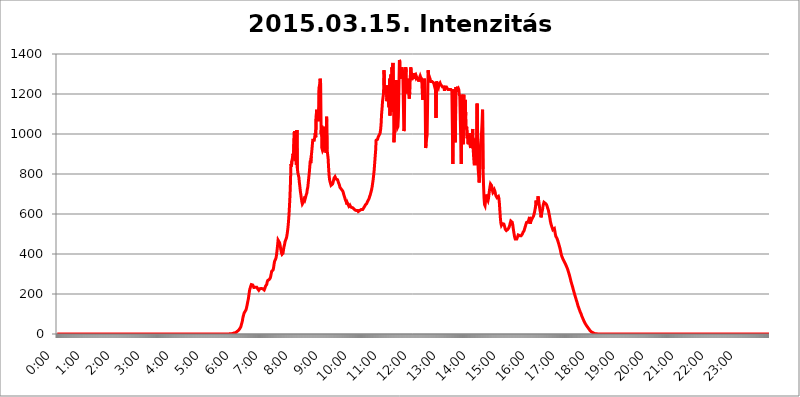
| Category | 2015.03.15. Intenzitás [W/m^2] |
|---|---|
| 0.0 | -0.256 |
| 0.0006944444444444445 | -0.256 |
| 0.001388888888888889 | -0.256 |
| 0.0020833333333333333 | -0.256 |
| 0.002777777777777778 | -0.256 |
| 0.003472222222222222 | -0.256 |
| 0.004166666666666667 | -0.256 |
| 0.004861111111111111 | -0.256 |
| 0.005555555555555556 | -0.256 |
| 0.0062499999999999995 | -0.256 |
| 0.006944444444444444 | -0.256 |
| 0.007638888888888889 | -0.256 |
| 0.008333333333333333 | -0.256 |
| 0.009027777777777779 | -0.256 |
| 0.009722222222222222 | -0.256 |
| 0.010416666666666666 | -0.256 |
| 0.011111111111111112 | -0.256 |
| 0.011805555555555555 | -0.256 |
| 0.012499999999999999 | -0.256 |
| 0.013194444444444444 | -0.256 |
| 0.013888888888888888 | -0.256 |
| 0.014583333333333332 | -0.256 |
| 0.015277777777777777 | -0.256 |
| 0.015972222222222224 | -0.256 |
| 0.016666666666666666 | -0.256 |
| 0.017361111111111112 | -0.256 |
| 0.018055555555555557 | -0.256 |
| 0.01875 | -0.256 |
| 0.019444444444444445 | -0.256 |
| 0.02013888888888889 | -0.256 |
| 0.020833333333333332 | -0.256 |
| 0.02152777777777778 | -0.256 |
| 0.022222222222222223 | -0.256 |
| 0.02291666666666667 | -0.256 |
| 0.02361111111111111 | -0.256 |
| 0.024305555555555556 | -0.256 |
| 0.024999999999999998 | -0.256 |
| 0.025694444444444447 | -0.256 |
| 0.02638888888888889 | -0.256 |
| 0.027083333333333334 | -0.256 |
| 0.027777777777777776 | -0.256 |
| 0.02847222222222222 | -0.256 |
| 0.029166666666666664 | -0.256 |
| 0.029861111111111113 | -0.256 |
| 0.030555555555555555 | -0.256 |
| 0.03125 | -0.256 |
| 0.03194444444444445 | -0.256 |
| 0.03263888888888889 | -0.256 |
| 0.03333333333333333 | -0.256 |
| 0.034027777777777775 | -0.256 |
| 0.034722222222222224 | -0.256 |
| 0.035416666666666666 | -0.256 |
| 0.036111111111111115 | -0.256 |
| 0.03680555555555556 | -0.256 |
| 0.0375 | -0.256 |
| 0.03819444444444444 | -0.256 |
| 0.03888888888888889 | -0.256 |
| 0.03958333333333333 | -0.256 |
| 0.04027777777777778 | -0.256 |
| 0.04097222222222222 | -0.256 |
| 0.041666666666666664 | -0.256 |
| 0.042361111111111106 | -0.256 |
| 0.04305555555555556 | -0.256 |
| 0.043750000000000004 | -0.256 |
| 0.044444444444444446 | -0.256 |
| 0.04513888888888889 | -0.256 |
| 0.04583333333333334 | -0.256 |
| 0.04652777777777778 | -0.256 |
| 0.04722222222222222 | -0.256 |
| 0.04791666666666666 | -0.256 |
| 0.04861111111111111 | -0.256 |
| 0.049305555555555554 | -0.256 |
| 0.049999999999999996 | -0.256 |
| 0.05069444444444445 | -0.256 |
| 0.051388888888888894 | -0.256 |
| 0.052083333333333336 | -0.256 |
| 0.05277777777777778 | -0.256 |
| 0.05347222222222222 | -0.256 |
| 0.05416666666666667 | -0.256 |
| 0.05486111111111111 | -0.256 |
| 0.05555555555555555 | -0.256 |
| 0.05625 | -0.256 |
| 0.05694444444444444 | -0.256 |
| 0.057638888888888885 | -0.256 |
| 0.05833333333333333 | -0.256 |
| 0.05902777777777778 | -0.256 |
| 0.059722222222222225 | -0.256 |
| 0.06041666666666667 | -0.256 |
| 0.061111111111111116 | -0.256 |
| 0.06180555555555556 | -0.256 |
| 0.0625 | -0.256 |
| 0.06319444444444444 | -0.256 |
| 0.06388888888888888 | -0.256 |
| 0.06458333333333334 | -0.256 |
| 0.06527777777777778 | -0.256 |
| 0.06597222222222222 | -0.256 |
| 0.06666666666666667 | -0.256 |
| 0.06736111111111111 | -0.256 |
| 0.06805555555555555 | -0.256 |
| 0.06874999999999999 | -0.256 |
| 0.06944444444444443 | -0.256 |
| 0.07013888888888889 | -0.256 |
| 0.07083333333333333 | -0.256 |
| 0.07152777777777779 | -0.256 |
| 0.07222222222222223 | -0.256 |
| 0.07291666666666667 | -0.256 |
| 0.07361111111111111 | -0.256 |
| 0.07430555555555556 | -0.256 |
| 0.075 | -0.256 |
| 0.07569444444444444 | -0.256 |
| 0.0763888888888889 | -0.256 |
| 0.07708333333333334 | -0.256 |
| 0.07777777777777778 | -0.256 |
| 0.07847222222222222 | -0.256 |
| 0.07916666666666666 | -0.256 |
| 0.0798611111111111 | -0.256 |
| 0.08055555555555556 | -0.256 |
| 0.08125 | -0.256 |
| 0.08194444444444444 | -0.256 |
| 0.08263888888888889 | -0.256 |
| 0.08333333333333333 | -0.256 |
| 0.08402777777777777 | -0.256 |
| 0.08472222222222221 | -0.256 |
| 0.08541666666666665 | -0.256 |
| 0.08611111111111112 | -0.256 |
| 0.08680555555555557 | -0.256 |
| 0.08750000000000001 | -0.256 |
| 0.08819444444444445 | -0.256 |
| 0.08888888888888889 | -0.256 |
| 0.08958333333333333 | -0.256 |
| 0.09027777777777778 | -0.256 |
| 0.09097222222222222 | -0.256 |
| 0.09166666666666667 | -0.256 |
| 0.09236111111111112 | -0.256 |
| 0.09305555555555556 | -0.256 |
| 0.09375 | -0.256 |
| 0.09444444444444444 | -0.256 |
| 0.09513888888888888 | -0.256 |
| 0.09583333333333333 | -0.256 |
| 0.09652777777777777 | -0.256 |
| 0.09722222222222222 | -0.256 |
| 0.09791666666666667 | -0.256 |
| 0.09861111111111111 | -0.256 |
| 0.09930555555555555 | -0.256 |
| 0.09999999999999999 | -0.256 |
| 0.10069444444444443 | -0.256 |
| 0.1013888888888889 | -0.256 |
| 0.10208333333333335 | -0.256 |
| 0.10277777777777779 | -0.256 |
| 0.10347222222222223 | -0.256 |
| 0.10416666666666667 | -0.256 |
| 0.10486111111111111 | -0.256 |
| 0.10555555555555556 | -0.256 |
| 0.10625 | -0.256 |
| 0.10694444444444444 | -0.256 |
| 0.1076388888888889 | -0.256 |
| 0.10833333333333334 | -0.256 |
| 0.10902777777777778 | -0.256 |
| 0.10972222222222222 | -0.256 |
| 0.1111111111111111 | -0.256 |
| 0.11180555555555556 | -0.256 |
| 0.11180555555555556 | -0.256 |
| 0.1125 | -0.256 |
| 0.11319444444444444 | -0.256 |
| 0.11388888888888889 | -0.256 |
| 0.11458333333333333 | -0.256 |
| 0.11527777777777777 | -0.256 |
| 0.11597222222222221 | -0.256 |
| 0.11666666666666665 | -0.256 |
| 0.1173611111111111 | -0.256 |
| 0.11805555555555557 | -0.256 |
| 0.11944444444444445 | -0.256 |
| 0.12013888888888889 | -0.256 |
| 0.12083333333333333 | -0.256 |
| 0.12152777777777778 | -0.256 |
| 0.12222222222222223 | -0.256 |
| 0.12291666666666667 | -0.256 |
| 0.12291666666666667 | -0.256 |
| 0.12361111111111112 | -0.256 |
| 0.12430555555555556 | -0.256 |
| 0.125 | -0.256 |
| 0.12569444444444444 | -0.256 |
| 0.12638888888888888 | -0.256 |
| 0.12708333333333333 | -0.256 |
| 0.16875 | -0.256 |
| 0.12847222222222224 | -0.256 |
| 0.12916666666666668 | -0.256 |
| 0.12986111111111112 | -0.256 |
| 0.13055555555555556 | -0.256 |
| 0.13125 | -0.256 |
| 0.13194444444444445 | -0.256 |
| 0.1326388888888889 | -0.256 |
| 0.13333333333333333 | -0.256 |
| 0.13402777777777777 | -0.256 |
| 0.13402777777777777 | -0.256 |
| 0.13472222222222222 | -0.256 |
| 0.13541666666666666 | -0.256 |
| 0.1361111111111111 | -0.256 |
| 0.13749999999999998 | -0.256 |
| 0.13819444444444443 | -0.256 |
| 0.1388888888888889 | -0.256 |
| 0.13958333333333334 | -0.256 |
| 0.14027777777777778 | -0.256 |
| 0.14097222222222222 | -0.256 |
| 0.14166666666666666 | -0.256 |
| 0.1423611111111111 | -0.256 |
| 0.14305555555555557 | -0.256 |
| 0.14375000000000002 | -0.256 |
| 0.14444444444444446 | -0.256 |
| 0.1451388888888889 | -0.256 |
| 0.1451388888888889 | -0.256 |
| 0.14652777777777778 | -0.256 |
| 0.14722222222222223 | -0.256 |
| 0.14791666666666667 | -0.256 |
| 0.1486111111111111 | -0.256 |
| 0.14930555555555555 | -0.256 |
| 0.15 | -0.256 |
| 0.15069444444444444 | -0.256 |
| 0.15138888888888888 | -0.256 |
| 0.15208333333333332 | -0.256 |
| 0.15277777777777776 | -0.256 |
| 0.15347222222222223 | -0.256 |
| 0.15416666666666667 | -0.256 |
| 0.15486111111111112 | -0.256 |
| 0.15555555555555556 | -0.256 |
| 0.15625 | -0.256 |
| 0.15694444444444444 | -0.256 |
| 0.15763888888888888 | -0.256 |
| 0.15833333333333333 | -0.256 |
| 0.15902777777777777 | -0.256 |
| 0.15972222222222224 | -0.256 |
| 0.16041666666666668 | -0.256 |
| 0.16111111111111112 | -0.256 |
| 0.16180555555555556 | -0.256 |
| 0.1625 | -0.256 |
| 0.16319444444444445 | -0.256 |
| 0.1638888888888889 | -0.256 |
| 0.16458333333333333 | -0.256 |
| 0.16527777777777777 | -0.256 |
| 0.16597222222222222 | -0.256 |
| 0.16666666666666666 | -0.256 |
| 0.1673611111111111 | -0.256 |
| 0.16805555555555554 | -0.256 |
| 0.16874999999999998 | -0.256 |
| 0.16944444444444443 | -0.256 |
| 0.17013888888888887 | -0.256 |
| 0.1708333333333333 | -0.256 |
| 0.17152777777777775 | -0.256 |
| 0.17222222222222225 | -0.256 |
| 0.1729166666666667 | -0.256 |
| 0.17361111111111113 | -0.256 |
| 0.17430555555555557 | -0.256 |
| 0.17500000000000002 | -0.256 |
| 0.17569444444444446 | -0.256 |
| 0.1763888888888889 | -0.256 |
| 0.17708333333333334 | -0.256 |
| 0.17777777777777778 | -0.256 |
| 0.17847222222222223 | -0.256 |
| 0.17916666666666667 | -0.256 |
| 0.1798611111111111 | -0.256 |
| 0.18055555555555555 | -0.256 |
| 0.18125 | -0.256 |
| 0.18194444444444444 | -0.256 |
| 0.1826388888888889 | -0.256 |
| 0.18333333333333335 | -0.256 |
| 0.1840277777777778 | -0.256 |
| 0.18472222222222223 | -0.256 |
| 0.18541666666666667 | -0.256 |
| 0.18611111111111112 | -0.256 |
| 0.18680555555555556 | -0.256 |
| 0.1875 | -0.256 |
| 0.18819444444444444 | -0.256 |
| 0.18888888888888888 | -0.256 |
| 0.18958333333333333 | -0.256 |
| 0.19027777777777777 | -0.256 |
| 0.1909722222222222 | -0.256 |
| 0.19166666666666665 | -0.256 |
| 0.19236111111111112 | -0.256 |
| 0.19305555555555554 | -0.256 |
| 0.19375 | -0.256 |
| 0.19444444444444445 | -0.256 |
| 0.1951388888888889 | -0.256 |
| 0.19583333333333333 | -0.256 |
| 0.19652777777777777 | -0.256 |
| 0.19722222222222222 | -0.256 |
| 0.19791666666666666 | -0.256 |
| 0.1986111111111111 | -0.256 |
| 0.19930555555555554 | -0.256 |
| 0.19999999999999998 | -0.256 |
| 0.20069444444444443 | -0.256 |
| 0.20138888888888887 | -0.256 |
| 0.2020833333333333 | -0.256 |
| 0.2027777777777778 | -0.256 |
| 0.2034722222222222 | -0.256 |
| 0.2041666666666667 | -0.256 |
| 0.20486111111111113 | -0.256 |
| 0.20555555555555557 | -0.256 |
| 0.20625000000000002 | -0.256 |
| 0.20694444444444446 | -0.256 |
| 0.2076388888888889 | -0.256 |
| 0.20833333333333334 | -0.256 |
| 0.20902777777777778 | -0.256 |
| 0.20972222222222223 | -0.256 |
| 0.21041666666666667 | -0.256 |
| 0.2111111111111111 | -0.256 |
| 0.21180555555555555 | -0.256 |
| 0.2125 | -0.256 |
| 0.21319444444444444 | -0.256 |
| 0.2138888888888889 | -0.256 |
| 0.21458333333333335 | -0.256 |
| 0.2152777777777778 | -0.256 |
| 0.21597222222222223 | -0.256 |
| 0.21666666666666667 | -0.256 |
| 0.21736111111111112 | -0.256 |
| 0.21805555555555556 | -0.256 |
| 0.21875 | -0.256 |
| 0.21944444444444444 | -0.256 |
| 0.22013888888888888 | -0.256 |
| 0.22083333333333333 | -0.256 |
| 0.22152777777777777 | -0.256 |
| 0.2222222222222222 | -0.256 |
| 0.22291666666666665 | -0.256 |
| 0.2236111111111111 | -0.256 |
| 0.22430555555555556 | -0.256 |
| 0.225 | -0.256 |
| 0.22569444444444445 | -0.256 |
| 0.2263888888888889 | -0.256 |
| 0.22708333333333333 | -0.256 |
| 0.22777777777777777 | -0.256 |
| 0.22847222222222222 | -0.256 |
| 0.22916666666666666 | -0.256 |
| 0.2298611111111111 | -0.256 |
| 0.23055555555555554 | -0.256 |
| 0.23124999999999998 | -0.256 |
| 0.23194444444444443 | -0.256 |
| 0.23263888888888887 | -0.256 |
| 0.2333333333333333 | -0.256 |
| 0.2340277777777778 | -0.256 |
| 0.2347222222222222 | -0.256 |
| 0.2354166666666667 | -0.256 |
| 0.23611111111111113 | -0.256 |
| 0.23680555555555557 | -0.256 |
| 0.23750000000000002 | -0.256 |
| 0.23819444444444446 | -0.256 |
| 0.2388888888888889 | -0.256 |
| 0.23958333333333334 | -0.256 |
| 0.24027777777777778 | -0.256 |
| 0.24097222222222223 | 1.09 |
| 0.24166666666666667 | 1.09 |
| 0.2423611111111111 | 1.09 |
| 0.24305555555555555 | 1.09 |
| 0.24375 | 1.09 |
| 0.24444444444444446 | 2.439 |
| 0.24513888888888888 | 2.439 |
| 0.24583333333333335 | 2.439 |
| 0.2465277777777778 | 3.791 |
| 0.24722222222222223 | 3.791 |
| 0.24791666666666667 | 5.146 |
| 0.24861111111111112 | 6.503 |
| 0.24930555555555556 | 6.503 |
| 0.25 | 6.503 |
| 0.25069444444444444 | 9.225 |
| 0.2513888888888889 | 10.589 |
| 0.2520833333333333 | 11.956 |
| 0.25277777777777777 | 14.696 |
| 0.2534722222222222 | 16.069 |
| 0.25416666666666665 | 18.822 |
| 0.2548611111111111 | 21.582 |
| 0.2555555555555556 | 24.35 |
| 0.25625000000000003 | 28.514 |
| 0.2569444444444445 | 32.691 |
| 0.2576388888888889 | 38.28 |
| 0.25833333333333336 | 48.1 |
| 0.2590277777777778 | 56.548 |
| 0.25972222222222224 | 66.423 |
| 0.2604166666666667 | 81.946 |
| 0.2611111111111111 | 91.806 |
| 0.26180555555555557 | 101.634 |
| 0.2625 | 107.232 |
| 0.26319444444444445 | 105.834 |
| 0.2638888888888889 | 110.025 |
| 0.26458333333333334 | 119.766 |
| 0.2652777777777778 | 128.065 |
| 0.2659722222222222 | 139.051 |
| 0.26666666666666666 | 151.286 |
| 0.2673611111111111 | 164.712 |
| 0.26805555555555555 | 176.631 |
| 0.26875 | 193.561 |
| 0.26944444444444443 | 211.405 |
| 0.2701388888888889 | 225.146 |
| 0.2708333333333333 | 232.54 |
| 0.27152777777777776 | 241.083 |
| 0.2722222222222222 | 247.131 |
| 0.27291666666666664 | 248.335 |
| 0.2736111111111111 | 247.131 |
| 0.2743055555555555 | 244.717 |
| 0.27499999999999997 | 238.651 |
| 0.27569444444444446 | 232.54 |
| 0.27638888888888885 | 230.083 |
| 0.27708333333333335 | 230.083 |
| 0.2777777777777778 | 233.766 |
| 0.27847222222222223 | 238.651 |
| 0.2791666666666667 | 237.433 |
| 0.2798611111111111 | 233.766 |
| 0.28055555555555556 | 230.083 |
| 0.28125 | 225.146 |
| 0.28194444444444444 | 221.422 |
| 0.2826388888888889 | 218.93 |
| 0.2833333333333333 | 221.422 |
| 0.28402777777777777 | 226.383 |
| 0.2847222222222222 | 225.146 |
| 0.28541666666666665 | 225.146 |
| 0.28611111111111115 | 227.618 |
| 0.28680555555555554 | 227.618 |
| 0.28750000000000003 | 230.083 |
| 0.2881944444444445 | 226.383 |
| 0.2888888888888889 | 223.906 |
| 0.28958333333333336 | 221.422 |
| 0.2902777777777778 | 220.177 |
| 0.29097222222222224 | 226.383 |
| 0.2916666666666667 | 233.766 |
| 0.2923611111111111 | 241.083 |
| 0.29305555555555557 | 243.507 |
| 0.29375 | 247.131 |
| 0.29444444444444445 | 259.104 |
| 0.2951388888888889 | 267.396 |
| 0.29583333333333334 | 268.576 |
| 0.2965277777777778 | 268.576 |
| 0.2972222222222222 | 272.106 |
| 0.29791666666666666 | 276.797 |
| 0.2986111111111111 | 279.136 |
| 0.29930555555555555 | 287.293 |
| 0.3 | 300.041 |
| 0.30069444444444443 | 312.749 |
| 0.3013888888888889 | 316.215 |
| 0.3020833333333333 | 316.215 |
| 0.30277777777777776 | 320.84 |
| 0.3034722222222222 | 332.443 |
| 0.30416666666666664 | 350.049 |
| 0.3048611111111111 | 364.422 |
| 0.3055555555555555 | 369.291 |
| 0.30624999999999997 | 374.206 |
| 0.3069444444444444 | 381.674 |
| 0.3076388888888889 | 398.318 |
| 0.30833333333333335 | 419.883 |
| 0.3090277777777778 | 442.962 |
| 0.30972222222222223 | 469.557 |
| 0.3104166666666667 | 474.507 |
| 0.3111111111111111 | 464.688 |
| 0.31180555555555556 | 456.747 |
| 0.3125 | 445.971 |
| 0.31319444444444444 | 429.773 |
| 0.3138888888888889 | 415.735 |
| 0.3145833333333333 | 404.916 |
| 0.31527777777777777 | 398.318 |
| 0.3159722222222222 | 395.711 |
| 0.31666666666666665 | 403.587 |
| 0.31736111111111115 | 422.678 |
| 0.31805555555555554 | 437.031 |
| 0.31875000000000003 | 445.971 |
| 0.3194444444444445 | 461.486 |
| 0.3201388888888889 | 467.925 |
| 0.32083333333333336 | 474.507 |
| 0.3215277777777778 | 481.238 |
| 0.32222222222222224 | 495.176 |
| 0.3229166666666667 | 511.671 |
| 0.3236111111111111 | 533.12 |
| 0.32430555555555557 | 560.495 |
| 0.325 | 595.145 |
| 0.32569444444444445 | 638.912 |
| 0.3263888888888889 | 688.102 |
| 0.32708333333333334 | 757.414 |
| 0.3277777777777778 | 849.92 |
| 0.3284722222222222 | 837.51 |
| 0.32916666666666666 | 866.865 |
| 0.3298611111111111 | 879.878 |
| 0.33055555555555555 | 902.16 |
| 0.33125 | 893.157 |
| 0.33194444444444443 | 897.643 |
| 0.3326388888888889 | 1014.809 |
| 0.3333333333333333 | 866.865 |
| 0.3340277777777778 | 888.701 |
| 0.3347222222222222 | 871.173 |
| 0.3354166666666667 | 845.755 |
| 0.3361111111111111 | 1020.106 |
| 0.3368055555555556 | 825.351 |
| 0.33749999999999997 | 805.632 |
| 0.33819444444444446 | 801.768 |
| 0.33888888888888885 | 782.842 |
| 0.33958333333333335 | 757.414 |
| 0.34027777777777773 | 736.574 |
| 0.34097222222222223 | 713.328 |
| 0.3416666666666666 | 697.399 |
| 0.3423611111111111 | 678.997 |
| 0.3430555555555555 | 661.343 |
| 0.34375 | 649.973 |
| 0.3444444444444445 | 649.973 |
| 0.3451388888888889 | 658.471 |
| 0.3458333333333334 | 664.234 |
| 0.34652777777777777 | 670.078 |
| 0.34722222222222227 | 688.102 |
| 0.34791666666666665 | 678.997 |
| 0.34861111111111115 | 682.011 |
| 0.34930555555555554 | 697.399 |
| 0.35000000000000003 | 703.704 |
| 0.3506944444444444 | 723.153 |
| 0.3513888888888889 | 733.184 |
| 0.3520833333333333 | 757.414 |
| 0.3527777777777778 | 782.842 |
| 0.3534722222222222 | 805.632 |
| 0.3541666666666667 | 801.768 |
| 0.3548611111111111 | 866.865 |
| 0.35555555555555557 | 854.113 |
| 0.35625 | 888.701 |
| 0.35694444444444445 | 911.285 |
| 0.3576388888888889 | 939.404 |
| 0.35833333333333334 | 968.671 |
| 0.3590277777777778 | 973.663 |
| 0.3597222222222222 | 963.712 |
| 0.36041666666666666 | 968.671 |
| 0.3611111111111111 | 983.747 |
| 0.36180555555555555 | 1004.318 |
| 0.3625 | 983.747 |
| 0.36319444444444443 | 1092.203 |
| 0.3638888888888889 | 1121.587 |
| 0.3645833333333333 | 1080.711 |
| 0.3652777777777778 | 1115.634 |
| 0.3659722222222222 | 1080.711 |
| 0.3666666666666667 | 1063.751 |
| 0.3673611111111111 | 1235.465 |
| 0.3680555555555556 | 1248.934 |
| 0.36874999999999997 | 1276.38 |
| 0.36944444444444446 | 1248.934 |
| 0.37013888888888885 | 999.125 |
| 0.37083333333333335 | 1041.644 |
| 0.37152777777777773 | 925.203 |
| 0.37222222222222223 | 915.893 |
| 0.3729166666666666 | 915.893 |
| 0.3736111111111111 | 925.203 |
| 0.3743055555555555 | 944.201 |
| 0.375 | 1036.206 |
| 0.3756944444444445 | 944.201 |
| 0.3763888888888889 | 915.893 |
| 0.3770833333333334 | 906.707 |
| 0.37777777777777777 | 1086.439 |
| 0.37847222222222227 | 920.533 |
| 0.37916666666666665 | 915.893 |
| 0.37986111111111115 | 879.878 |
| 0.38055555555555554 | 833.43 |
| 0.38125000000000003 | 794.119 |
| 0.3819444444444444 | 771.794 |
| 0.3826388888888889 | 760.972 |
| 0.3833333333333333 | 757.414 |
| 0.3840277777777778 | 743.425 |
| 0.3847222222222222 | 743.425 |
| 0.3854166666666667 | 746.886 |
| 0.3861111111111111 | 750.371 |
| 0.38680555555555557 | 757.414 |
| 0.3875 | 768.162 |
| 0.38819444444444445 | 779.134 |
| 0.3888888888888889 | 782.842 |
| 0.38958333333333334 | 786.575 |
| 0.3902777777777778 | 782.842 |
| 0.3909722222222222 | 775.451 |
| 0.39166666666666666 | 775.451 |
| 0.3923611111111111 | 775.451 |
| 0.39305555555555555 | 771.794 |
| 0.39375 | 764.555 |
| 0.39444444444444443 | 757.414 |
| 0.3951388888888889 | 750.371 |
| 0.3958333333333333 | 743.425 |
| 0.3965277777777778 | 733.184 |
| 0.3972222222222222 | 729.817 |
| 0.3979166666666667 | 726.474 |
| 0.3986111111111111 | 726.474 |
| 0.3993055555555556 | 719.855 |
| 0.39999999999999997 | 716.58 |
| 0.40069444444444446 | 713.328 |
| 0.40138888888888885 | 703.704 |
| 0.40208333333333335 | 694.278 |
| 0.40277777777777773 | 691.18 |
| 0.40347222222222223 | 678.997 |
| 0.4041666666666666 | 670.078 |
| 0.4048611111111111 | 664.234 |
| 0.4055555555555555 | 658.471 |
| 0.40625 | 647.179 |
| 0.4069444444444445 | 655.618 |
| 0.4076388888888889 | 655.618 |
| 0.4083333333333334 | 644.405 |
| 0.40902777777777777 | 638.912 |
| 0.40972222222222227 | 641.649 |
| 0.41041666666666665 | 644.405 |
| 0.41111111111111115 | 638.912 |
| 0.41180555555555554 | 636.194 |
| 0.41250000000000003 | 633.495 |
| 0.4131944444444444 | 633.495 |
| 0.4138888888888889 | 633.495 |
| 0.4145833333333333 | 630.814 |
| 0.4152777777777778 | 628.152 |
| 0.4159722222222222 | 625.508 |
| 0.4166666666666667 | 622.881 |
| 0.4173611111111111 | 620.273 |
| 0.41805555555555557 | 622.881 |
| 0.41875 | 620.273 |
| 0.41944444444444445 | 617.682 |
| 0.4201388888888889 | 615.11 |
| 0.42083333333333334 | 617.682 |
| 0.4215277777777778 | 617.682 |
| 0.4222222222222222 | 612.554 |
| 0.42291666666666666 | 610.016 |
| 0.4236111111111111 | 615.11 |
| 0.42430555555555555 | 617.682 |
| 0.425 | 617.682 |
| 0.42569444444444443 | 615.11 |
| 0.4263888888888889 | 622.881 |
| 0.4270833333333333 | 625.508 |
| 0.4277777777777778 | 620.273 |
| 0.4284722222222222 | 622.881 |
| 0.4291666666666667 | 625.508 |
| 0.4298611111111111 | 630.814 |
| 0.4305555555555556 | 633.495 |
| 0.43124999999999997 | 638.912 |
| 0.43194444444444446 | 644.405 |
| 0.43263888888888885 | 647.179 |
| 0.43333333333333335 | 647.179 |
| 0.43402777777777773 | 652.786 |
| 0.43472222222222223 | 658.471 |
| 0.4354166666666666 | 664.234 |
| 0.4361111111111111 | 667.146 |
| 0.4368055555555555 | 673.03 |
| 0.4375 | 678.997 |
| 0.4381944444444445 | 688.102 |
| 0.4388888888888889 | 694.278 |
| 0.4395833333333334 | 703.704 |
| 0.44027777777777777 | 713.328 |
| 0.44097222222222227 | 723.153 |
| 0.44166666666666665 | 736.574 |
| 0.44236111111111115 | 753.881 |
| 0.44305555555555554 | 771.794 |
| 0.44375000000000003 | 794.119 |
| 0.4444444444444444 | 817.382 |
| 0.4451388888888889 | 849.92 |
| 0.4458333333333333 | 884.274 |
| 0.4465277777777778 | 915.893 |
| 0.4472222222222222 | 968.671 |
| 0.4479166666666667 | 968.671 |
| 0.4486111111111111 | 973.663 |
| 0.44930555555555557 | 973.663 |
| 0.45 | 983.747 |
| 0.45069444444444445 | 988.839 |
| 0.4513888888888889 | 993.965 |
| 0.45208333333333334 | 999.125 |
| 0.4527777777777778 | 1004.318 |
| 0.4534722222222222 | 1020.106 |
| 0.45416666666666666 | 1047.117 |
| 0.4548611111111111 | 1098.004 |
| 0.45555555555555555 | 1127.578 |
| 0.45625 | 1164.337 |
| 0.45694444444444443 | 1164.337 |
| 0.4576388888888889 | 1202.523 |
| 0.4583333333333333 | 1318.845 |
| 0.4590277777777778 | 1209.029 |
| 0.4597222222222222 | 1222.164 |
| 0.4604166666666667 | 1228.794 |
| 0.4611111111111111 | 1202.523 |
| 0.4618055555555556 | 1242.179 |
| 0.46249999999999997 | 1164.337 |
| 0.46319444444444446 | 1228.794 |
| 0.46388888888888885 | 1235.465 |
| 0.46458333333333335 | 1151.928 |
| 0.46527777777777773 | 1133.607 |
| 0.46597222222222223 | 1276.38 |
| 0.4666666666666666 | 1092.203 |
| 0.4673611111111111 | 1092.203 |
| 0.4680555555555555 | 1297.416 |
| 0.46875 | 1109.72 |
| 0.4694444444444445 | 1333.352 |
| 0.4701388888888889 | 1304.515 |
| 0.4708333333333334 | 1355.45 |
| 0.47152777777777777 | 1255.731 |
| 0.47222222222222227 | 958.785 |
| 0.47291666666666665 | 1014.809 |
| 0.47361111111111115 | 1248.934 |
| 0.47430555555555554 | 1109.72 |
| 0.47500000000000003 | 1269.454 |
| 0.4756944444444444 | 1242.179 |
| 0.4763888888888889 | 1052.625 |
| 0.4770833333333333 | 1030.804 |
| 0.4777777777777778 | 1036.206 |
| 0.4784722222222222 | 1086.439 |
| 0.4791666666666667 | 1086.439 |
| 0.4798611111111111 | 1370.408 |
| 0.48055555555555557 | 1362.906 |
| 0.48125 | 1276.38 |
| 0.48194444444444445 | 1276.38 |
| 0.4826388888888889 | 1318.845 |
| 0.48333333333333334 | 1333.352 |
| 0.4840277777777778 | 1333.352 |
| 0.4847222222222222 | 1304.515 |
| 0.48541666666666666 | 1304.515 |
| 0.4861111111111111 | 1014.809 |
| 0.48680555555555555 | 1025.437 |
| 0.4875 | 1283.348 |
| 0.48819444444444443 | 1276.38 |
| 0.4888888888888889 | 1333.352 |
| 0.4895833333333333 | 1242.179 |
| 0.4902777777777778 | 1202.523 |
| 0.4909722222222222 | 1242.179 |
| 0.4916666666666667 | 1276.38 |
| 0.4923611111111111 | 1255.731 |
| 0.4930555555555556 | 1196.058 |
| 0.49374999999999997 | 1176.905 |
| 0.49444444444444446 | 1209.029 |
| 0.49513888888888885 | 1283.348 |
| 0.49583333333333335 | 1333.352 |
| 0.49652777777777773 | 1333.352 |
| 0.49722222222222223 | 1269.454 |
| 0.4979166666666666 | 1297.416 |
| 0.4986111111111111 | 1276.38 |
| 0.4993055555555555 | 1304.515 |
| 0.5 | 1276.38 |
| 0.5006944444444444 | 1304.515 |
| 0.5013888888888889 | 1297.416 |
| 0.5020833333333333 | 1290.36 |
| 0.5027777777777778 | 1283.348 |
| 0.5034722222222222 | 1290.36 |
| 0.5041666666666667 | 1290.36 |
| 0.5048611111111111 | 1290.36 |
| 0.5055555555555555 | 1269.454 |
| 0.50625 | 1283.348 |
| 0.5069444444444444 | 1262.571 |
| 0.5076388888888889 | 1276.38 |
| 0.5083333333333333 | 1283.348 |
| 0.5090277777777777 | 1290.36 |
| 0.5097222222222222 | 1283.348 |
| 0.5104166666666666 | 1283.348 |
| 0.5111111111111112 | 1276.38 |
| 0.5118055555555555 | 1276.38 |
| 0.5125000000000001 | 1170.601 |
| 0.5131944444444444 | 1269.454 |
| 0.513888888888889 | 1262.571 |
| 0.5145833333333333 | 1276.38 |
| 0.5152777777777778 | 1269.454 |
| 0.5159722222222222 | 1189.633 |
| 0.5166666666666667 | 929.905 |
| 0.517361111111111 | 949.03 |
| 0.5180555555555556 | 978.688 |
| 0.5187499999999999 | 993.965 |
| 0.5194444444444445 | 1151.928 |
| 0.5201388888888888 | 1318.845 |
| 0.5208333333333334 | 1297.416 |
| 0.5215277777777778 | 1290.36 |
| 0.5222222222222223 | 1283.348 |
| 0.5229166666666667 | 1276.38 |
| 0.5236111111111111 | 1262.571 |
| 0.5243055555555556 | 1262.571 |
| 0.525 | 1262.571 |
| 0.5256944444444445 | 1262.571 |
| 0.5263888888888889 | 1262.571 |
| 0.5270833333333333 | 1262.571 |
| 0.5277777777777778 | 1255.731 |
| 0.5284722222222222 | 1248.934 |
| 0.5291666666666667 | 1248.934 |
| 0.5298611111111111 | 1228.794 |
| 0.5305555555555556 | 1235.465 |
| 0.53125 | 1080.711 |
| 0.5319444444444444 | 1262.571 |
| 0.5326388888888889 | 1255.731 |
| 0.5333333333333333 | 1248.934 |
| 0.5340277777777778 | 1242.179 |
| 0.5347222222222222 | 1235.465 |
| 0.5354166666666667 | 1248.934 |
| 0.5361111111111111 | 1248.934 |
| 0.5368055555555555 | 1255.731 |
| 0.5375 | 1248.934 |
| 0.5381944444444444 | 1248.934 |
| 0.5388888888888889 | 1242.179 |
| 0.5395833333333333 | 1242.179 |
| 0.5402777777777777 | 1235.465 |
| 0.5409722222222222 | 1235.465 |
| 0.5416666666666666 | 1235.465 |
| 0.5423611111111112 | 1235.465 |
| 0.5430555555555555 | 1215.576 |
| 0.5437500000000001 | 1235.465 |
| 0.5444444444444444 | 1235.465 |
| 0.545138888888889 | 1235.465 |
| 0.5458333333333333 | 1235.465 |
| 0.5465277777777778 | 1235.465 |
| 0.5472222222222222 | 1235.465 |
| 0.5479166666666667 | 1222.164 |
| 0.548611111111111 | 1222.164 |
| 0.5493055555555556 | 1222.164 |
| 0.5499999999999999 | 1222.164 |
| 0.5506944444444445 | 1222.164 |
| 0.5513888888888888 | 1222.164 |
| 0.5520833333333334 | 1222.164 |
| 0.5527777777777778 | 1222.164 |
| 0.5534722222222223 | 1215.576 |
| 0.5541666666666667 | 1215.576 |
| 0.5548611111111111 | 849.92 |
| 0.5555555555555556 | 1222.164 |
| 0.55625 | 1222.164 |
| 0.5569444444444445 | 978.688 |
| 0.5576388888888889 | 1222.164 |
| 0.5583333333333333 | 958.785 |
| 0.5590277777777778 | 1235.465 |
| 0.5597222222222222 | 1235.465 |
| 0.5604166666666667 | 1235.465 |
| 0.5611111111111111 | 1222.164 |
| 0.5618055555555556 | 1222.164 |
| 0.5625 | 1228.794 |
| 0.5631944444444444 | 1222.164 |
| 0.5638888888888889 | 1196.058 |
| 0.5645833333333333 | 1189.633 |
| 0.5652777777777778 | 1189.633 |
| 0.5659722222222222 | 1189.633 |
| 0.5666666666666667 | 849.92 |
| 0.5673611111111111 | 1196.058 |
| 0.5680555555555555 | 1151.928 |
| 0.56875 | 1151.928 |
| 0.5694444444444444 | 949.03 |
| 0.5701388888888889 | 1196.058 |
| 0.5708333333333333 | 1069.368 |
| 0.5715277777777777 | 1052.625 |
| 0.5722222222222222 | 1170.601 |
| 0.5729166666666666 | 1092.203 |
| 0.5736111111111112 | 1025.437 |
| 0.5743055555555555 | 1036.206 |
| 0.5750000000000001 | 978.688 |
| 0.5756944444444444 | 1004.318 |
| 0.576388888888889 | 949.03 |
| 0.5770833333333333 | 978.688 |
| 0.5777777777777778 | 1004.318 |
| 0.5784722222222222 | 963.712 |
| 0.5791666666666667 | 939.404 |
| 0.579861111111111 | 929.905 |
| 0.5805555555555556 | 925.203 |
| 0.5812499999999999 | 929.905 |
| 0.5819444444444445 | 958.785 |
| 0.5826388888888888 | 1025.437 |
| 0.5833333333333334 | 925.203 |
| 0.5840277777777778 | 884.274 |
| 0.5847222222222223 | 849.92 |
| 0.5854166666666667 | 849.92 |
| 0.5861111111111111 | 849.92 |
| 0.5868055555555556 | 849.92 |
| 0.5875 | 978.688 |
| 0.5881944444444445 | 944.201 |
| 0.5888888888888889 | 1151.928 |
| 0.5895833333333333 | 988.839 |
| 0.5902777777777778 | 829.377 |
| 0.5909722222222222 | 794.119 |
| 0.5916666666666667 | 757.414 |
| 0.5923611111111111 | 782.842 |
| 0.5930555555555556 | 906.707 |
| 0.59375 | 949.03 |
| 0.5944444444444444 | 973.663 |
| 0.5951388888888889 | 1009.546 |
| 0.5958333333333333 | 1058.17 |
| 0.5965277777777778 | 1121.587 |
| 0.5972222222222222 | 825.351 |
| 0.5979166666666667 | 739.988 |
| 0.5986111111111111 | 678.997 |
| 0.5993055555555555 | 647.179 |
| 0.6 | 641.649 |
| 0.6006944444444444 | 664.234 |
| 0.6013888888888889 | 688.102 |
| 0.6020833333333333 | 697.399 |
| 0.6027777777777777 | 685.046 |
| 0.6034722222222222 | 673.03 |
| 0.6041666666666666 | 667.146 |
| 0.6048611111111112 | 678.997 |
| 0.6055555555555555 | 700.54 |
| 0.6062500000000001 | 719.855 |
| 0.6069444444444444 | 736.574 |
| 0.607638888888889 | 750.371 |
| 0.6083333333333333 | 753.881 |
| 0.6090277777777778 | 743.425 |
| 0.6097222222222222 | 733.184 |
| 0.6104166666666667 | 716.58 |
| 0.611111111111111 | 706.89 |
| 0.6118055555555556 | 706.89 |
| 0.6124999999999999 | 713.328 |
| 0.6131944444444445 | 719.855 |
| 0.6138888888888888 | 713.328 |
| 0.6145833333333334 | 700.54 |
| 0.6152777777777778 | 691.18 |
| 0.6159722222222223 | 688.102 |
| 0.6166666666666667 | 682.011 |
| 0.6173611111111111 | 682.011 |
| 0.6180555555555556 | 685.046 |
| 0.61875 | 688.102 |
| 0.6194444444444445 | 678.997 |
| 0.6201388888888889 | 652.786 |
| 0.6208333333333333 | 615.11 |
| 0.6215277777777778 | 578.542 |
| 0.6222222222222222 | 553.97 |
| 0.6229166666666667 | 543.376 |
| 0.6236111111111111 | 545.467 |
| 0.6243055555555556 | 551.823 |
| 0.625 | 553.97 |
| 0.6256944444444444 | 553.97 |
| 0.6263888888888889 | 549.691 |
| 0.6270833333333333 | 541.298 |
| 0.6277777777777778 | 533.12 |
| 0.6284722222222222 | 523.186 |
| 0.6291666666666667 | 519.3 |
| 0.6298611111111111 | 517.375 |
| 0.6305555555555555 | 517.375 |
| 0.63125 | 519.3 |
| 0.6319444444444444 | 523.186 |
| 0.6326388888888889 | 527.122 |
| 0.6333333333333333 | 531.108 |
| 0.6340277777777777 | 537.182 |
| 0.6347222222222222 | 545.467 |
| 0.6354166666666666 | 556.131 |
| 0.6361111111111112 | 564.917 |
| 0.6368055555555555 | 567.15 |
| 0.6375000000000001 | 564.917 |
| 0.6381944444444444 | 558.305 |
| 0.638888888888889 | 545.467 |
| 0.6395833333333333 | 527.122 |
| 0.6402777777777778 | 509.793 |
| 0.6409722222222222 | 495.176 |
| 0.6416666666666667 | 482.945 |
| 0.642361111111111 | 474.507 |
| 0.6430555555555556 | 471.198 |
| 0.6437499999999999 | 471.198 |
| 0.6444444444444445 | 474.507 |
| 0.6451388888888888 | 481.238 |
| 0.6458333333333334 | 488.126 |
| 0.6465277777777778 | 495.176 |
| 0.6472222222222223 | 496.965 |
| 0.6479166666666667 | 495.176 |
| 0.6486111111111111 | 491.63 |
| 0.6493055555555556 | 489.873 |
| 0.65 | 489.873 |
| 0.6506944444444445 | 491.63 |
| 0.6513888888888889 | 493.398 |
| 0.6520833333333333 | 498.764 |
| 0.6527777777777778 | 504.229 |
| 0.6534722222222222 | 509.793 |
| 0.6541666666666667 | 511.671 |
| 0.6548611111111111 | 517.375 |
| 0.6555555555555556 | 527.122 |
| 0.65625 | 535.145 |
| 0.6569444444444444 | 543.376 |
| 0.6576388888888889 | 551.823 |
| 0.6583333333333333 | 558.305 |
| 0.6590277777777778 | 560.495 |
| 0.6597222222222222 | 560.495 |
| 0.6604166666666667 | 560.495 |
| 0.6611111111111111 | 560.495 |
| 0.6618055555555555 | 560.495 |
| 0.6625 | 585.562 |
| 0.6631944444444444 | 551.823 |
| 0.6638888888888889 | 558.305 |
| 0.6645833333333333 | 564.917 |
| 0.6652777777777777 | 571.661 |
| 0.6659722222222222 | 576.233 |
| 0.6666666666666666 | 580.866 |
| 0.6673611111111111 | 585.562 |
| 0.6680555555555556 | 590.321 |
| 0.6687500000000001 | 600.035 |
| 0.6694444444444444 | 610.016 |
| 0.6701388888888888 | 622.881 |
| 0.6708333333333334 | 638.912 |
| 0.6715277777777778 | 667.146 |
| 0.6722222222222222 | 649.973 |
| 0.6729166666666666 | 652.786 |
| 0.6736111111111112 | 661.343 |
| 0.6743055555555556 | 688.102 |
| 0.6749999999999999 | 673.03 |
| 0.6756944444444444 | 655.618 |
| 0.6763888888888889 | 636.194 |
| 0.6770833333333334 | 617.682 |
| 0.6777777777777777 | 607.495 |
| 0.6784722222222223 | 583.206 |
| 0.6791666666666667 | 595.145 |
| 0.6798611111111111 | 610.016 |
| 0.6805555555555555 | 620.273 |
| 0.68125 | 638.912 |
| 0.6819444444444445 | 649.973 |
| 0.6826388888888889 | 658.471 |
| 0.6833333333333332 | 661.343 |
| 0.6840277777777778 | 655.618 |
| 0.6847222222222222 | 652.786 |
| 0.6854166666666667 | 652.786 |
| 0.686111111111111 | 647.179 |
| 0.6868055555555556 | 641.649 |
| 0.6875 | 633.495 |
| 0.6881944444444444 | 625.508 |
| 0.688888888888889 | 617.682 |
| 0.6895833333333333 | 604.992 |
| 0.6902777777777778 | 592.725 |
| 0.6909722222222222 | 578.542 |
| 0.6916666666666668 | 562.699 |
| 0.6923611111111111 | 551.823 |
| 0.6930555555555555 | 543.376 |
| 0.69375 | 535.145 |
| 0.6944444444444445 | 529.108 |
| 0.6951388888888889 | 521.237 |
| 0.6958333333333333 | 521.237 |
| 0.6965277777777777 | 525.148 |
| 0.6972222222222223 | 527.122 |
| 0.6979166666666666 | 513.561 |
| 0.6986111111111111 | 498.764 |
| 0.6993055555555556 | 488.126 |
| 0.7000000000000001 | 484.662 |
| 0.7006944444444444 | 479.541 |
| 0.7013888888888888 | 472.848 |
| 0.7020833333333334 | 466.302 |
| 0.7027777777777778 | 456.747 |
| 0.7034722222222222 | 449.011 |
| 0.7041666666666666 | 439.982 |
| 0.7048611111111112 | 431.211 |
| 0.7055555555555556 | 421.278 |
| 0.7062499999999999 | 408.934 |
| 0.7069444444444444 | 397.012 |
| 0.7076388888888889 | 389.27 |
| 0.7083333333333334 | 382.93 |
| 0.7090277777777777 | 376.682 |
| 0.7097222222222223 | 371.742 |
| 0.7104166666666667 | 366.851 |
| 0.7111111111111111 | 362.004 |
| 0.7118055555555555 | 357.196 |
| 0.7125 | 352.423 |
| 0.7131944444444445 | 346.501 |
| 0.7138888888888889 | 340.62 |
| 0.7145833333333332 | 334.774 |
| 0.7152777777777778 | 328.955 |
| 0.7159722222222222 | 321.998 |
| 0.7166666666666667 | 313.904 |
| 0.717361111111111 | 305.819 |
| 0.7180555555555556 | 297.728 |
| 0.71875 | 288.455 |
| 0.7194444444444444 | 279.136 |
| 0.720138888888889 | 268.576 |
| 0.7208333333333333 | 259.104 |
| 0.7215277777777778 | 250.739 |
| 0.7222222222222222 | 242.296 |
| 0.7229166666666668 | 233.766 |
| 0.7236111111111111 | 223.906 |
| 0.7243055555555555 | 215.177 |
| 0.725 | 206.348 |
| 0.7256944444444445 | 197.419 |
| 0.7263888888888889 | 189.685 |
| 0.7270833333333333 | 180.569 |
| 0.7277777777777777 | 172.676 |
| 0.7284722222222223 | 164.712 |
| 0.7291666666666666 | 156.678 |
| 0.7298611111111111 | 147.223 |
| 0.7305555555555556 | 139.051 |
| 0.7312500000000001 | 132.196 |
| 0.7319444444444444 | 125.304 |
| 0.7326388888888888 | 118.378 |
| 0.7333333333333334 | 111.42 |
| 0.7340277777777778 | 105.834 |
| 0.7347222222222222 | 100.233 |
| 0.7354166666666666 | 93.212 |
| 0.7361111111111112 | 86.175 |
| 0.7368055555555556 | 80.536 |
| 0.7374999999999999 | 74.892 |
| 0.7381944444444444 | 69.246 |
| 0.7388888888888889 | 63.6 |
| 0.7395833333333334 | 59.368 |
| 0.7402777777777777 | 53.73 |
| 0.7409722222222223 | 49.507 |
| 0.7416666666666667 | 45.29 |
| 0.7423611111111111 | 42.483 |
| 0.7430555555555555 | 38.28 |
| 0.74375 | 34.086 |
| 0.7444444444444445 | 31.297 |
| 0.7451388888888889 | 27.124 |
| 0.7458333333333332 | 24.35 |
| 0.7465277777777778 | 20.201 |
| 0.7472222222222222 | 17.444 |
| 0.7479166666666667 | 14.696 |
| 0.748611111111111 | 11.956 |
| 0.7493055555555556 | 10.589 |
| 0.75 | 9.225 |
| 0.7506944444444444 | 7.862 |
| 0.751388888888889 | 6.503 |
| 0.7520833333333333 | 5.146 |
| 0.7527777777777778 | 3.791 |
| 0.7534722222222222 | 3.791 |
| 0.7541666666666668 | 2.439 |
| 0.7548611111111111 | 1.09 |
| 0.7555555555555555 | 1.09 |
| 0.75625 | 1.09 |
| 0.7569444444444445 | 1.09 |
| 0.7576388888888889 | -0.256 |
| 0.7583333333333333 | -0.256 |
| 0.7590277777777777 | -0.256 |
| 0.7597222222222223 | -0.256 |
| 0.7604166666666666 | -0.256 |
| 0.7611111111111111 | -0.256 |
| 0.7618055555555556 | -0.256 |
| 0.7625000000000001 | -0.256 |
| 0.7631944444444444 | -0.256 |
| 0.7638888888888888 | -0.256 |
| 0.7645833333333334 | -0.256 |
| 0.7652777777777778 | -0.256 |
| 0.7659722222222222 | -0.256 |
| 0.7666666666666666 | -0.256 |
| 0.7673611111111112 | -0.256 |
| 0.7680555555555556 | -0.256 |
| 0.7687499999999999 | -0.256 |
| 0.7694444444444444 | -0.256 |
| 0.7701388888888889 | -0.256 |
| 0.7708333333333334 | -0.256 |
| 0.7715277777777777 | -0.256 |
| 0.7722222222222223 | -0.256 |
| 0.7729166666666667 | -0.256 |
| 0.7736111111111111 | -0.256 |
| 0.7743055555555555 | -0.256 |
| 0.775 | -0.256 |
| 0.7756944444444445 | -0.256 |
| 0.7763888888888889 | -0.256 |
| 0.7770833333333332 | -0.256 |
| 0.7777777777777778 | -0.256 |
| 0.7784722222222222 | -0.256 |
| 0.7791666666666667 | -0.256 |
| 0.779861111111111 | -0.256 |
| 0.7805555555555556 | -0.256 |
| 0.78125 | -0.256 |
| 0.7819444444444444 | -0.256 |
| 0.782638888888889 | -0.256 |
| 0.7833333333333333 | -0.256 |
| 0.7840277777777778 | -0.256 |
| 0.7847222222222222 | -0.256 |
| 0.7854166666666668 | -0.256 |
| 0.7861111111111111 | -0.256 |
| 0.7868055555555555 | -0.256 |
| 0.7875 | -0.256 |
| 0.7881944444444445 | -0.256 |
| 0.7888888888888889 | -0.256 |
| 0.7895833333333333 | -0.256 |
| 0.7902777777777777 | -0.256 |
| 0.7909722222222223 | -0.256 |
| 0.7916666666666666 | -0.256 |
| 0.7923611111111111 | -0.256 |
| 0.7930555555555556 | -0.256 |
| 0.7937500000000001 | -0.256 |
| 0.7944444444444444 | -0.256 |
| 0.7951388888888888 | -0.256 |
| 0.7958333333333334 | -0.256 |
| 0.7965277777777778 | -0.256 |
| 0.7972222222222222 | -0.256 |
| 0.7979166666666666 | -0.256 |
| 0.7986111111111112 | -0.256 |
| 0.7993055555555556 | -0.256 |
| 0.7999999999999999 | -0.256 |
| 0.8006944444444444 | -0.256 |
| 0.8013888888888889 | -0.256 |
| 0.8020833333333334 | -0.256 |
| 0.8027777777777777 | -0.256 |
| 0.8034722222222223 | -0.256 |
| 0.8041666666666667 | -0.256 |
| 0.8048611111111111 | -0.256 |
| 0.8055555555555555 | -0.256 |
| 0.80625 | -0.256 |
| 0.8069444444444445 | -0.256 |
| 0.8076388888888889 | -0.256 |
| 0.8083333333333332 | -0.256 |
| 0.8090277777777778 | -0.256 |
| 0.8097222222222222 | -0.256 |
| 0.8104166666666667 | -0.256 |
| 0.811111111111111 | -0.256 |
| 0.8118055555555556 | -0.256 |
| 0.8125 | -0.256 |
| 0.8131944444444444 | -0.256 |
| 0.813888888888889 | -0.256 |
| 0.8145833333333333 | -0.256 |
| 0.8152777777777778 | -0.256 |
| 0.8159722222222222 | -0.256 |
| 0.8166666666666668 | -0.256 |
| 0.8173611111111111 | -0.256 |
| 0.8180555555555555 | -0.256 |
| 0.81875 | -0.256 |
| 0.8194444444444445 | -0.256 |
| 0.8201388888888889 | -0.256 |
| 0.8208333333333333 | -0.256 |
| 0.8215277777777777 | -0.256 |
| 0.8222222222222223 | -0.256 |
| 0.8229166666666666 | -0.256 |
| 0.8236111111111111 | -0.256 |
| 0.8243055555555556 | -0.256 |
| 0.8250000000000001 | -0.256 |
| 0.8256944444444444 | -0.256 |
| 0.8263888888888888 | -0.256 |
| 0.8270833333333334 | -0.256 |
| 0.8277777777777778 | -0.256 |
| 0.8284722222222222 | -0.256 |
| 0.8291666666666666 | -0.256 |
| 0.8298611111111112 | -0.256 |
| 0.8305555555555556 | -0.256 |
| 0.8312499999999999 | -0.256 |
| 0.8319444444444444 | -0.256 |
| 0.8326388888888889 | -0.256 |
| 0.8333333333333334 | -0.256 |
| 0.8340277777777777 | -0.256 |
| 0.8347222222222223 | -0.256 |
| 0.8354166666666667 | -0.256 |
| 0.8361111111111111 | -0.256 |
| 0.8368055555555555 | -0.256 |
| 0.8375 | -0.256 |
| 0.8381944444444445 | -0.256 |
| 0.8388888888888889 | -0.256 |
| 0.8395833333333332 | -0.256 |
| 0.8402777777777778 | -0.256 |
| 0.8409722222222222 | -0.256 |
| 0.8416666666666667 | -0.256 |
| 0.842361111111111 | -0.256 |
| 0.8430555555555556 | -0.256 |
| 0.84375 | -0.256 |
| 0.8444444444444444 | -0.256 |
| 0.845138888888889 | -0.256 |
| 0.8458333333333333 | -0.256 |
| 0.8465277777777778 | -0.256 |
| 0.8472222222222222 | -0.256 |
| 0.8479166666666668 | -0.256 |
| 0.8486111111111111 | -0.256 |
| 0.8493055555555555 | -0.256 |
| 0.85 | -0.256 |
| 0.8506944444444445 | -0.256 |
| 0.8513888888888889 | -0.256 |
| 0.8520833333333333 | -0.256 |
| 0.8527777777777777 | -0.256 |
| 0.8534722222222223 | -0.256 |
| 0.8541666666666666 | -0.256 |
| 0.8548611111111111 | -0.256 |
| 0.8555555555555556 | -0.256 |
| 0.8562500000000001 | -0.256 |
| 0.8569444444444444 | -0.256 |
| 0.8576388888888888 | -0.256 |
| 0.8583333333333334 | -0.256 |
| 0.8590277777777778 | -0.256 |
| 0.8597222222222222 | -0.256 |
| 0.8604166666666666 | -0.256 |
| 0.8611111111111112 | -0.256 |
| 0.8618055555555556 | -0.256 |
| 0.8624999999999999 | -0.256 |
| 0.8631944444444444 | -0.256 |
| 0.8638888888888889 | -0.256 |
| 0.8645833333333334 | -0.256 |
| 0.8652777777777777 | -0.256 |
| 0.8659722222222223 | -0.256 |
| 0.8666666666666667 | -0.256 |
| 0.8673611111111111 | -0.256 |
| 0.8680555555555555 | -0.256 |
| 0.86875 | -0.256 |
| 0.8694444444444445 | -0.256 |
| 0.8701388888888889 | -0.256 |
| 0.8708333333333332 | -0.256 |
| 0.8715277777777778 | -0.256 |
| 0.8722222222222222 | -0.256 |
| 0.8729166666666667 | -0.256 |
| 0.873611111111111 | -0.256 |
| 0.8743055555555556 | -0.256 |
| 0.875 | -0.256 |
| 0.8756944444444444 | -0.256 |
| 0.876388888888889 | -0.256 |
| 0.8770833333333333 | -0.256 |
| 0.8777777777777778 | -0.256 |
| 0.8784722222222222 | -0.256 |
| 0.8791666666666668 | -0.256 |
| 0.8798611111111111 | -0.256 |
| 0.8805555555555555 | -0.256 |
| 0.88125 | -0.256 |
| 0.8819444444444445 | -0.256 |
| 0.8826388888888889 | -0.256 |
| 0.8833333333333333 | -0.256 |
| 0.8840277777777777 | -0.256 |
| 0.8847222222222223 | -0.256 |
| 0.8854166666666666 | -0.256 |
| 0.8861111111111111 | -0.256 |
| 0.8868055555555556 | -0.256 |
| 0.8875000000000001 | -0.256 |
| 0.8881944444444444 | -0.256 |
| 0.8888888888888888 | -0.256 |
| 0.8895833333333334 | -0.256 |
| 0.8902777777777778 | -0.256 |
| 0.8909722222222222 | -0.256 |
| 0.8916666666666666 | -0.256 |
| 0.8923611111111112 | -0.256 |
| 0.8930555555555556 | -0.256 |
| 0.8937499999999999 | -0.256 |
| 0.8944444444444444 | -0.256 |
| 0.8951388888888889 | -0.256 |
| 0.8958333333333334 | -0.256 |
| 0.8965277777777777 | -0.256 |
| 0.8972222222222223 | -0.256 |
| 0.8979166666666667 | -0.256 |
| 0.8986111111111111 | -0.256 |
| 0.8993055555555555 | -0.256 |
| 0.9 | -0.256 |
| 0.9006944444444445 | -0.256 |
| 0.9013888888888889 | -0.256 |
| 0.9020833333333332 | -0.256 |
| 0.9027777777777778 | -0.256 |
| 0.9034722222222222 | -0.256 |
| 0.9041666666666667 | -0.256 |
| 0.904861111111111 | -0.256 |
| 0.9055555555555556 | -0.256 |
| 0.90625 | -0.256 |
| 0.9069444444444444 | -0.256 |
| 0.907638888888889 | -0.256 |
| 0.9083333333333333 | -0.256 |
| 0.9090277777777778 | -0.256 |
| 0.9097222222222222 | -0.256 |
| 0.9104166666666668 | -0.256 |
| 0.9111111111111111 | -0.256 |
| 0.9118055555555555 | -0.256 |
| 0.9125 | -0.256 |
| 0.9131944444444445 | -0.256 |
| 0.9138888888888889 | -0.256 |
| 0.9145833333333333 | -0.256 |
| 0.9152777777777777 | -0.256 |
| 0.9159722222222223 | -0.256 |
| 0.9166666666666666 | -0.256 |
| 0.9173611111111111 | -0.256 |
| 0.9180555555555556 | -0.256 |
| 0.9187500000000001 | -0.256 |
| 0.9194444444444444 | -0.256 |
| 0.9201388888888888 | -0.256 |
| 0.9208333333333334 | -0.256 |
| 0.9215277777777778 | -0.256 |
| 0.9222222222222222 | -0.256 |
| 0.9229166666666666 | -0.256 |
| 0.9236111111111112 | -0.256 |
| 0.9243055555555556 | -0.256 |
| 0.9249999999999999 | -0.256 |
| 0.9256944444444444 | -0.256 |
| 0.9263888888888889 | -0.256 |
| 0.9270833333333334 | -0.256 |
| 0.9277777777777777 | -0.256 |
| 0.9284722222222223 | -0.256 |
| 0.9291666666666667 | -0.256 |
| 0.9298611111111111 | -0.256 |
| 0.9305555555555555 | -0.256 |
| 0.93125 | -0.256 |
| 0.9319444444444445 | -0.256 |
| 0.9326388888888889 | -0.256 |
| 0.9333333333333332 | -0.256 |
| 0.9340277777777778 | -0.256 |
| 0.9347222222222222 | -0.256 |
| 0.9354166666666667 | -0.256 |
| 0.936111111111111 | -0.256 |
| 0.9368055555555556 | -0.256 |
| 0.9375 | -0.256 |
| 0.9381944444444444 | -0.256 |
| 0.938888888888889 | -0.256 |
| 0.9395833333333333 | -0.256 |
| 0.9402777777777778 | -0.256 |
| 0.9409722222222222 | -0.256 |
| 0.9416666666666668 | -0.256 |
| 0.9423611111111111 | -0.256 |
| 0.9430555555555555 | -0.256 |
| 0.94375 | -0.256 |
| 0.9444444444444445 | -0.256 |
| 0.9451388888888889 | -0.256 |
| 0.9458333333333333 | -0.256 |
| 0.9465277777777777 | -0.256 |
| 0.9472222222222223 | -0.256 |
| 0.9479166666666666 | -0.256 |
| 0.9486111111111111 | -0.256 |
| 0.9493055555555556 | -0.256 |
| 0.9500000000000001 | -0.256 |
| 0.9506944444444444 | -0.256 |
| 0.9513888888888888 | -0.256 |
| 0.9520833333333334 | -0.256 |
| 0.9527777777777778 | -0.256 |
| 0.9534722222222222 | -0.256 |
| 0.9541666666666666 | -0.256 |
| 0.9548611111111112 | -0.256 |
| 0.9555555555555556 | -0.256 |
| 0.9562499999999999 | -0.256 |
| 0.9569444444444444 | -0.256 |
| 0.9576388888888889 | -0.256 |
| 0.9583333333333334 | -0.256 |
| 0.9590277777777777 | -0.256 |
| 0.9597222222222223 | -0.256 |
| 0.9604166666666667 | -0.256 |
| 0.9611111111111111 | -0.256 |
| 0.9618055555555555 | -0.256 |
| 0.9625 | -0.256 |
| 0.9631944444444445 | -0.256 |
| 0.9638888888888889 | -0.256 |
| 0.9645833333333332 | -0.256 |
| 0.9652777777777778 | -0.256 |
| 0.9659722222222222 | -0.256 |
| 0.9666666666666667 | -0.256 |
| 0.967361111111111 | -0.256 |
| 0.9680555555555556 | -0.256 |
| 0.96875 | -0.256 |
| 0.9694444444444444 | -0.256 |
| 0.970138888888889 | -0.256 |
| 0.9708333333333333 | -0.256 |
| 0.9715277777777778 | -0.256 |
| 0.9722222222222222 | -0.256 |
| 0.9729166666666668 | -0.256 |
| 0.9736111111111111 | -0.256 |
| 0.9743055555555555 | -0.256 |
| 0.975 | -0.256 |
| 0.9756944444444445 | -0.256 |
| 0.9763888888888889 | -0.256 |
| 0.9770833333333333 | -0.256 |
| 0.9777777777777777 | -0.256 |
| 0.9784722222222223 | -0.256 |
| 0.9791666666666666 | -0.256 |
| 0.9798611111111111 | -0.256 |
| 0.9805555555555556 | -0.256 |
| 0.9812500000000001 | -0.256 |
| 0.9819444444444444 | -0.256 |
| 0.9826388888888888 | -0.256 |
| 0.9833333333333334 | -0.256 |
| 0.9840277777777778 | -0.256 |
| 0.9847222222222222 | -0.256 |
| 0.9854166666666666 | -0.256 |
| 0.9861111111111112 | -0.256 |
| 0.9868055555555556 | -0.256 |
| 0.9874999999999999 | -0.256 |
| 0.9881944444444444 | -0.256 |
| 0.9888888888888889 | -0.256 |
| 0.9895833333333334 | -0.256 |
| 0.9902777777777777 | -0.256 |
| 0.9909722222222223 | -0.256 |
| 0.9916666666666667 | -0.256 |
| 0.9923611111111111 | -0.256 |
| 0.9930555555555555 | -0.256 |
| 0.99375 | -0.256 |
| 0.9944444444444445 | -0.256 |
| 0.9951388888888889 | -0.256 |
| 0.9958333333333332 | -0.256 |
| 0.9965277777777778 | -0.256 |
| 0.9972222222222222 | -0.256 |
| 0.9979166666666667 | -0.256 |
| 0.998611111111111 | -0.256 |
| 0.9993055555555556 | 0 |